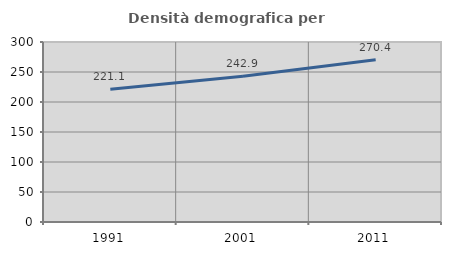
| Category | Densità demografica |
|---|---|
| 1991.0 | 221.101 |
| 2001.0 | 242.857 |
| 2011.0 | 270.366 |